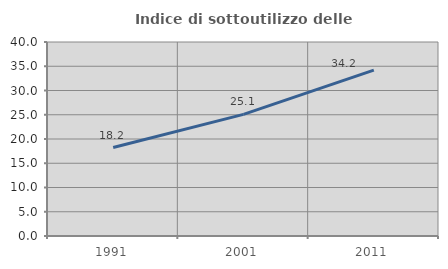
| Category | Indice di sottoutilizzo delle abitazioni  |
|---|---|
| 1991.0 | 18.24 |
| 2001.0 | 25.068 |
| 2011.0 | 34.188 |